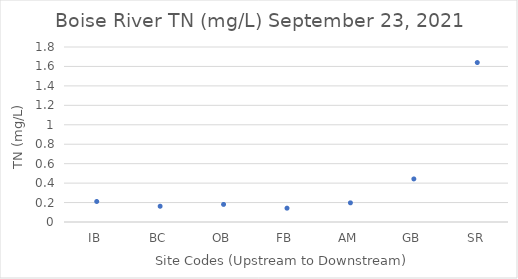
| Category | TN (mg/L) |
|---|---|
| IB | 0.211 |
| BC | 0.162 |
| OB | 0.181 |
| FB | 0.142 |
| AM | 0.197 |
| GB | 0.443 |
| SR | 1.64 |